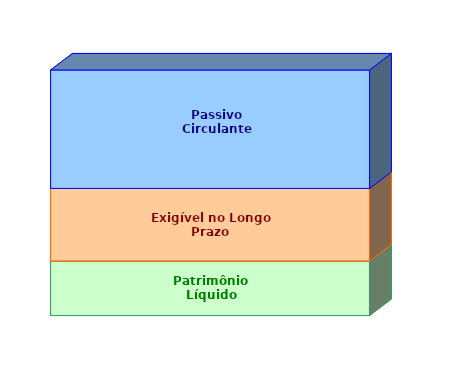
| Category | Patrimônio Líquido | Exigível no Longo Prazo | Passivo Circulante |
|---|---|---|---|
| 0 | 0.222 | 0.295 | 0.482 |